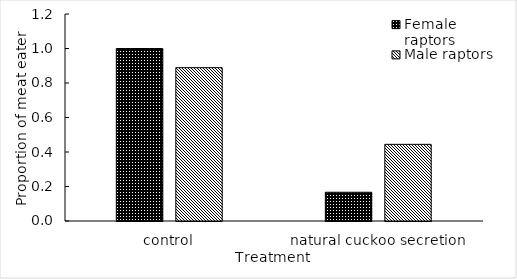
| Category | Female raptors | Male raptors |
|---|---|---|
| control | 1 | 0.889 |
| natural cuckoo secretion | 0.167 | 0.444 |